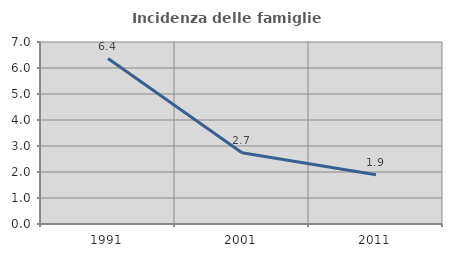
| Category | Incidenza delle famiglie numerose |
|---|---|
| 1991.0 | 6.363 |
| 2001.0 | 2.74 |
| 2011.0 | 1.89 |